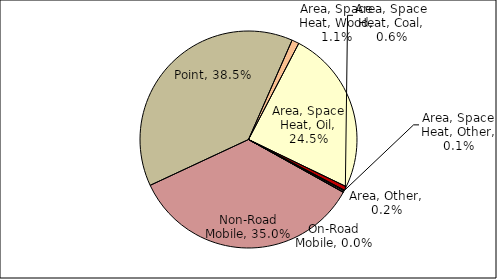
| Category | Series 0 |
|---|---|
| Point | 0.385 |
| Area, Space Heat, Wood | 0.011 |
| Area, Space Heat, Oil | 0.245 |
| Area, Space Heat, Coal | 0.006 |
| Area, Space Heat, Other | 0.001 |
| Area, Other | 0.002 |
| On-Road Mobile | 0 |
| Non-Road Mobile | 0.35 |